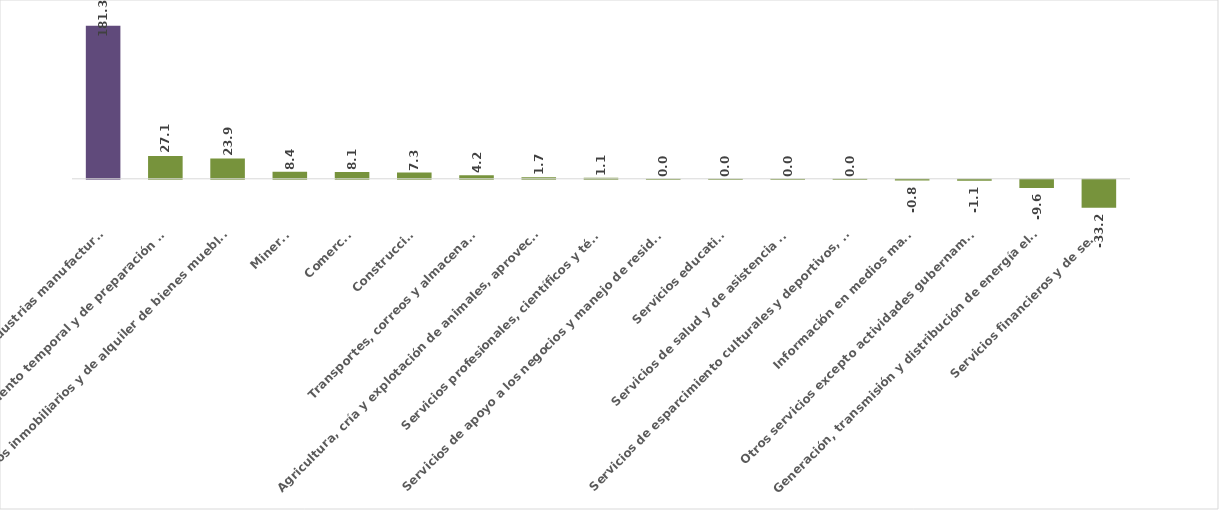
| Category | Series 0 |
|---|---|
| Industrias manufactureras | 181.344 |
| Servicios de alojamiento temporal y de preparación de alimentos y bebidas | 27.094 |
| Servicios inmobiliarios y de alquiler de bienes muebles e intangibles | 23.939 |
| Minería | 8.433 |
| Comercio | 8.133 |
| Construcción | 7.333 |
| Transportes, correos y almacenamiento | 4.184 |
| Agricultura, cría y explotación de animales, aprovechamiento forestal, pesca y caza | 1.738 |
| Servicios profesionales, científicos y técnicos | 1.102 |
| Servicios de apoyo a los negocios y manejo de residuos y desechos, y servicios de remediación | 0.003 |
| Servicios educativos | 0.003 |
| Servicios de salud y de asistencia social | 0.003 |
| Servicios de esparcimiento culturales y deportivos, y otros servicios recreativos | 0 |
| Información en medios masivos | -0.836 |
| Otros servicios excepto actividades gubernamentales | -1.092 |
| Generación, transmisión y distribución de energía eléctrica, suministro de agua y de gas por ductos al consumidor final | -9.646 |
| Servicios financieros y de seguros | -33.236 |